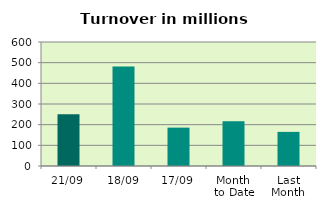
| Category | Series 0 |
|---|---|
| 21/09 | 250.943 |
| 18/09 | 481.539 |
| 17/09 | 185.737 |
| Month 
to Date | 216.766 |
| Last
Month | 165.075 |